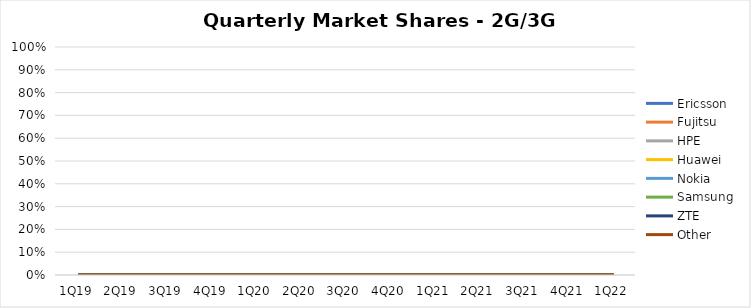
| Category | Ericsson | Fujitsu | HPE | Huawei | Nokia | Samsung | ZTE | Other |
|---|---|---|---|---|---|---|---|---|
| 1Q19 | 0 | 0 | 0 | 0 | 0 | 0 | 0 | 0 |
| 2Q19 | 0 | 0 | 0 | 0 | 0 | 0 | 0 | 0 |
| 3Q19 | 0 | 0 | 0 | 0 | 0 | 0 | 0 | 0 |
| 4Q19 | 0 | 0 | 0 | 0 | 0 | 0 | 0 | 0 |
| 1Q20 | 0 | 0 | 0 | 0 | 0 | 0 | 0 | 0 |
| 2Q20 | 0 | 0 | 0 | 0 | 0 | 0 | 0 | 0 |
| 3Q20 | 0 | 0 | 0 | 0 | 0 | 0 | 0 | 0 |
| 4Q20 | 0 | 0 | 0 | 0 | 0 | 0 | 0 | 0 |
| 1Q21 | 0 | 0 | 0 | 0 | 0 | 0 | 0 | 0 |
| 2Q21 | 0 | 0 | 0 | 0 | 0 | 0 | 0 | 0 |
| 3Q21 | 0 | 0 | 0 | 0 | 0 | 0 | 0 | 0 |
| 4Q21 | 0 | 0 | 0 | 0 | 0 | 0 | 0 | 0 |
| 1Q22 | 0 | 0 | 0 | 0 | 0 | 0 | 0 | 0 |